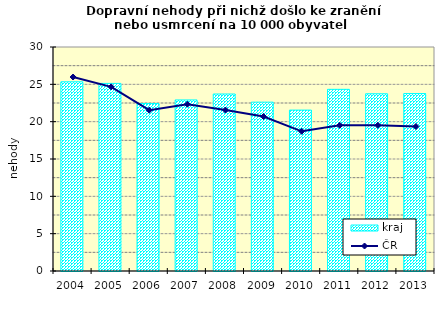
| Category | kraj |
|---|---|
| 2004.0 | 25.34 |
| 2005.0 | 25.124 |
| 2006.0 | 22.429 |
| 2007.0 | 22.911 |
| 2008.0 | 23.704 |
| 2009.0 | 22.613 |
| 2010.0 | 21.548 |
| 2011.0 | 24.331 |
| 2012.0 | 23.735 |
| 2013.0 | 23.764 |